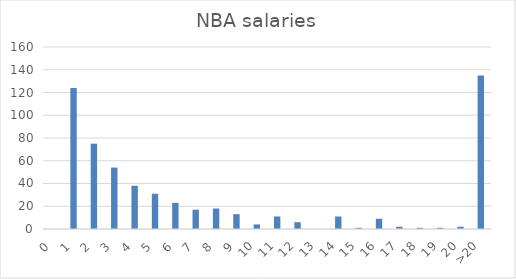
| Category | Series 0 |
|---|---|
| 0 | 0 |
| 1 | 124 |
| 2 | 75 |
| 3 | 54 |
| 4 | 38 |
| 5 | 31 |
| 6 | 23 |
| 7 | 17 |
| 8 | 18 |
| 9 | 13 |
| 10 | 4 |
| 11 | 11 |
| 12 | 6 |
| 13 | 0 |
| 14 | 11 |
| 15 | 1 |
| 16 | 9 |
| 17 | 2 |
| 18 | 1 |
| 19 | 1 |
| 20 | 2 |
| >20 | 135 |